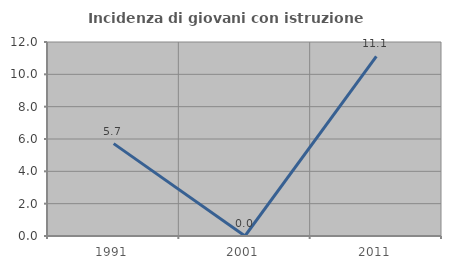
| Category | Incidenza di giovani con istruzione universitaria |
|---|---|
| 1991.0 | 5.714 |
| 2001.0 | 0 |
| 2011.0 | 11.111 |